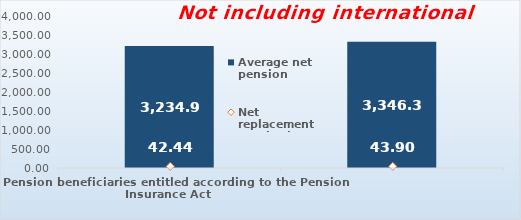
| Category | Average net pension  |
|---|---|
| Pension beneficiaries entitled according to the Pension Insurance Act   | 3234.95 |
| Pension beneficiaries entitled to pension FOR THE FIRST TIME in 2022 according to the Pension Insurance Act  - NEW BENEFICIARIES | 3346.298 |